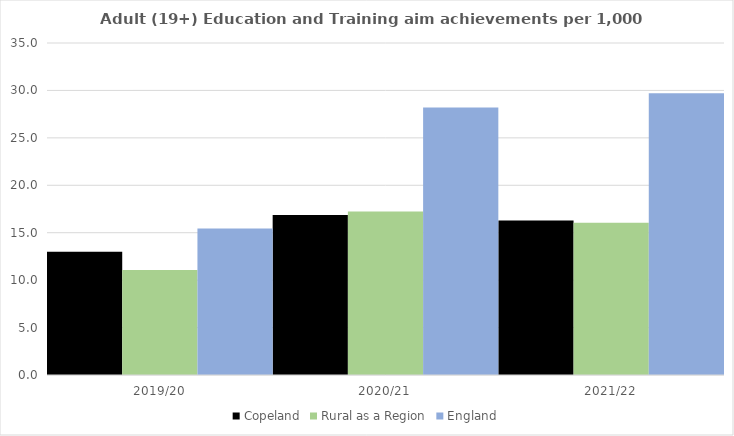
| Category | Copeland | Rural as a Region | England |
|---|---|---|---|
| 2019/20 | 12.986 | 11.081 | 15.446 |
| 2020/21 | 16.862 | 17.224 | 28.211 |
| 2021/22 | 16.296 | 16.063 | 29.711 |